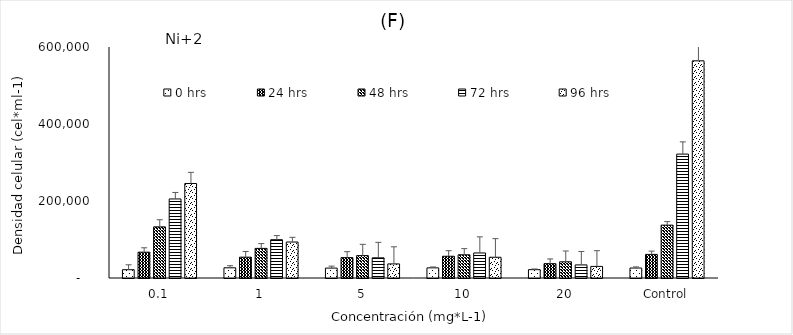
| Category | 0 hrs | 24 hrs | 48 hrs | 72 hrs | 96 hrs |
|---|---|---|---|---|---|
| 0,1 | 21577.669 | 67066.372 | 132857.292 | 205331.092 | 245408.332 |
| 1 | 26478.523 | 54119.717 | 76943.952 | 99481.359 | 93439.373 |
| 5 | 25719.872 | 52932.011 | 58156.677 | 52418.85 | 36595.142 |
| 10 | 26316.604 | 56490.297 | 60261.534 | 65043.616 | 53875.027 |
| 20 | 21639.337 | 37218.443 | 42063.01 | 33955.582 | 30113.632 |
| Control | 25870.726 | 61304.893 | 137311.789 | 321832.272 | 564054.656 |